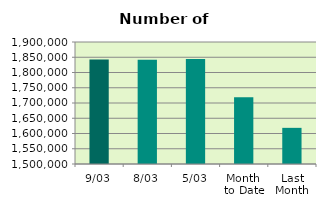
| Category | Series 0 |
|---|---|
| 9/03 | 1842330 |
| 8/03 | 1842114 |
| 5/03 | 1844308 |
| Month 
to Date | 1718665.143 |
| Last
Month | 1618522.4 |